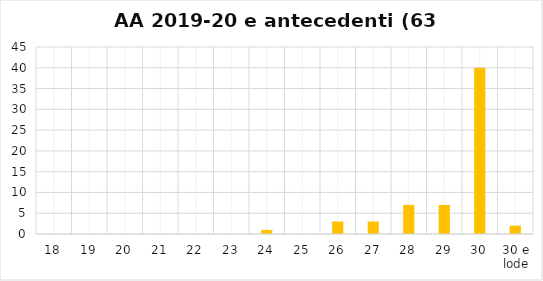
| Category | Series 0 |
|---|---|
| 18 | 0 |
| 19 | 0 |
| 20 | 0 |
| 21 | 0 |
| 22 | 0 |
| 23 | 0 |
| 24 | 1 |
| 25 | 0 |
| 26 | 3 |
| 27 | 3 |
| 28 | 7 |
| 29 | 7 |
| 30 | 40 |
| 30 e lode | 2 |